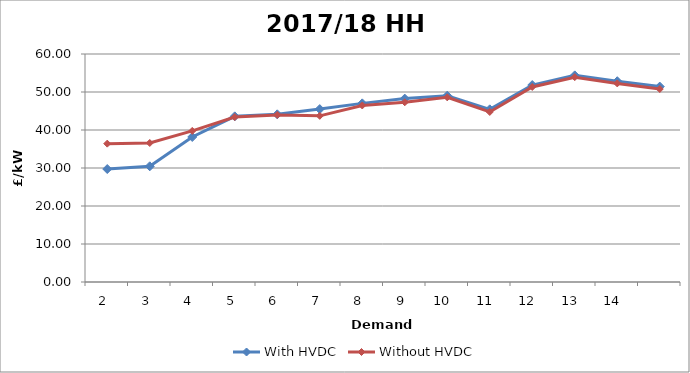
| Category | With HVDC | Without HVDC |
|---|---|---|
| 2.0 | 29.732 | 36.407 |
| 3.0 | 30.446 | 36.581 |
| 4.0 | 38.161 | 39.764 |
| 5.0 | 43.593 | 43.414 |
| 6.0 | 44.126 | 43.973 |
| 7.0 | 45.498 | 43.723 |
| 8.0 | 47.007 | 46.454 |
| 9.0 | 48.259 | 47.3 |
| 10.0 | 49.023 | 48.6 |
| 11.0 | 45.437 | 44.742 |
| 12.0 | 51.83 | 51.323 |
| 13.0 | 54.371 | 53.903 |
| 14.0 | 52.832 | 52.26 |